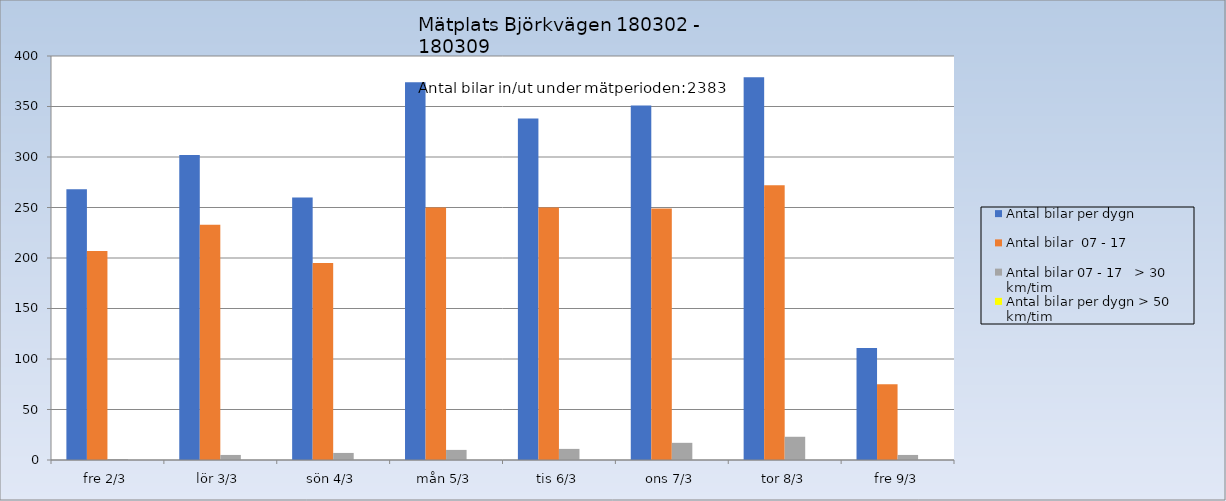
| Category | Antal bilar per dygn | Antal bilar  07 - 17 | Antal bilar 07 - 17   > 30 km/tim | Antal bilar per dygn > 50 km/tim |
|---|---|---|---|---|
| fre 2/3 | 268 | 207 | 1 | 0 |
| lör 3/3 | 302 | 233 | 5 | 0 |
| sön 4/3 | 260 | 195 | 7 | 0 |
| mån 5/3 | 374 | 250 | 10 | 0 |
| tis 6/3 | 338 | 250 | 11 | 0 |
| ons 7/3 | 351 | 249 | 17 | 0 |
| tor 8/3 | 379 | 272 | 23 | 0 |
| fre 9/3 | 111 | 75 | 5 | 0 |